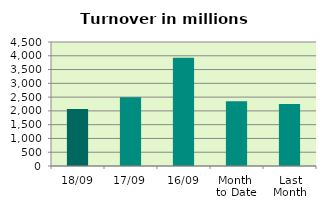
| Category | Series 0 |
|---|---|
| 18/09 | 2065.718 |
| 17/09 | 2499.033 |
| 16/09 | 3931.454 |
| Month 
to Date | 2347.13 |
| Last
Month | 2251.437 |